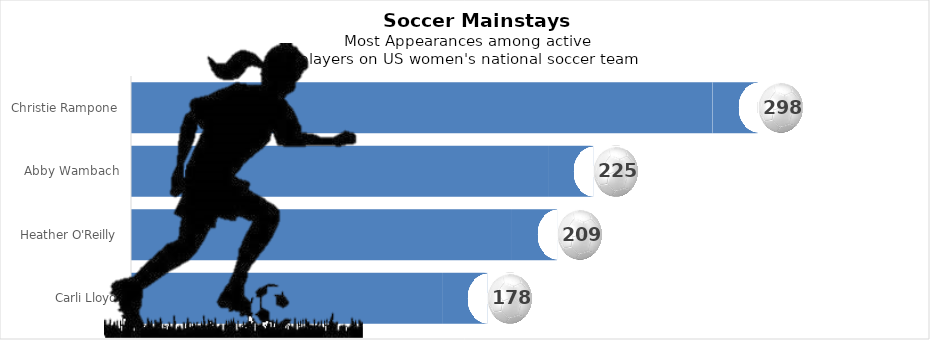
| Category | Series 1 | Series 2 | Series 3 |
|---|---|---|---|
| Christie Rampone | 258 | 20 | 20 |
| Abby Wambach | 185 | 20 | 20 |
| Heather O'Reilly | 169 | 20 | 20 |
| Carli Lloyd | 138 | 20 | 20 |